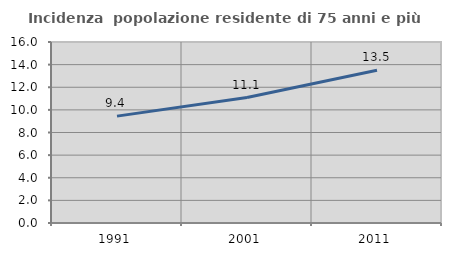
| Category | Incidenza  popolazione residente di 75 anni e più |
|---|---|
| 1991.0 | 9.448 |
| 2001.0 | 11.087 |
| 2011.0 | 13.496 |